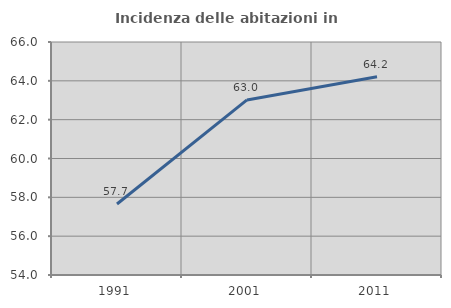
| Category | Incidenza delle abitazioni in proprietà  |
|---|---|
| 1991.0 | 57.659 |
| 2001.0 | 63.018 |
| 2011.0 | 64.21 |